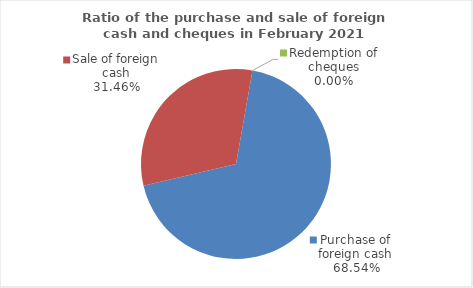
| Category | Series 0 |
|---|---|
| Purchase of foreign cash | 68.541 |
| Sale of foreign cash | 31.459 |
| Redemption of cheques | 0 |